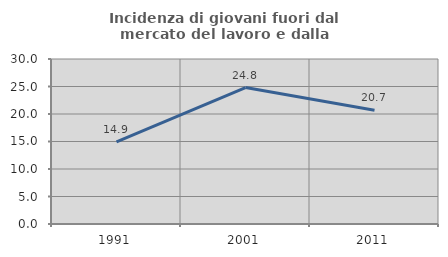
| Category | Incidenza di giovani fuori dal mercato del lavoro e dalla formazione  |
|---|---|
| 1991.0 | 14.921 |
| 2001.0 | 24.803 |
| 2011.0 | 20.673 |